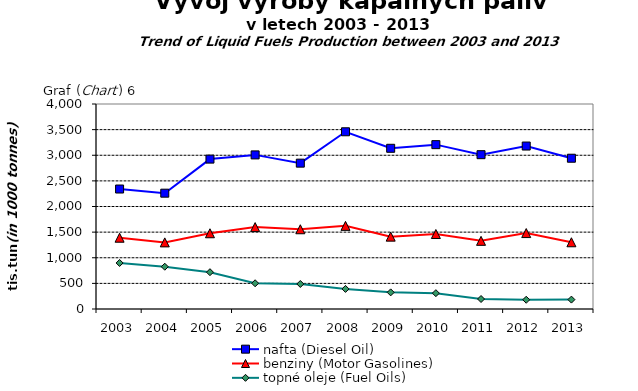
| Category | nafta (Diesel Oil) | benziny (Motor Gasolines) | topné oleje (Fuel Oils) |
|---|---|---|---|
| 2003.0 | 2341 | 1391 | 898 |
| 2004.0 | 2260 | 1300 | 825 |
| 2005.0 | 2925 | 1478 | 718 |
| 2006.0 | 3007 | 1598 | 502 |
| 2007.0 | 2846 | 1556 | 488 |
| 2008.0 | 3458 | 1622 | 392 |
| 2009.0 | 3135.727 | 1412 | 324.452 |
| 2010.0 | 3207 | 1463 | 309 |
| 2011.0 | 3011 | 1330 | 195 |
| 2012.0 | 3179.636 | 1481.461 | 180.446 |
| 2013.0 | 2941.929 | 1301.844 | 183.371 |